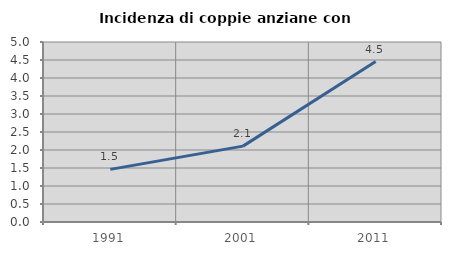
| Category | Incidenza di coppie anziane con figli |
|---|---|
| 1991.0 | 1.461 |
| 2001.0 | 2.107 |
| 2011.0 | 4.457 |